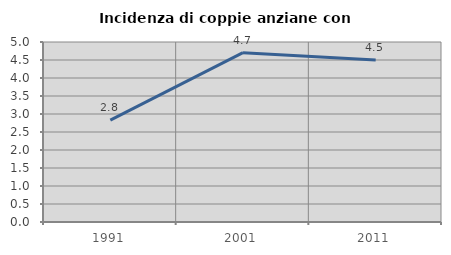
| Category | Incidenza di coppie anziane con figli |
|---|---|
| 1991.0 | 2.829 |
| 2001.0 | 4.703 |
| 2011.0 | 4.499 |